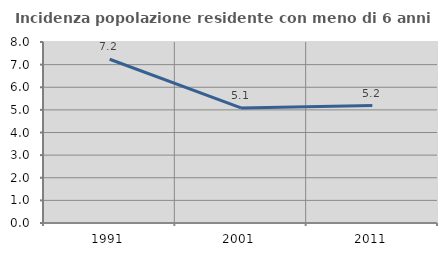
| Category | Incidenza popolazione residente con meno di 6 anni |
|---|---|
| 1991.0 | 7.237 |
| 2001.0 | 5.085 |
| 2011.0 | 5.19 |